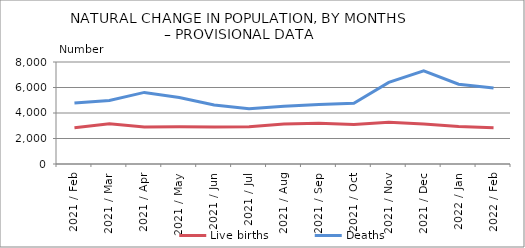
| Category | Live births | Deaths |
|---|---|---|
| 2021 / Feb | 2844 | 4790 |
| 2021 / Mar | 3155 | 4985 |
| 2021 / Apr | 2894 | 5615 |
| 2021 / May | 2913 | 5210 |
| 2021 / Jun | 2899 | 4629 |
| 2021 / Jul | 2930 | 4334 |
| 2021 / Aug | 3139 | 4532 |
| 2021 / Sep | 3191 | 4660 |
| 2021 / Oct | 3089 | 4764 |
| 2021 / Nov | 3276 | 6396 |
| 2021 / Dec | 3141 | 7313 |
| 2022 / Jan | 2949 | 6262 |
| 2022 / Feb | 2839 | 5956 |